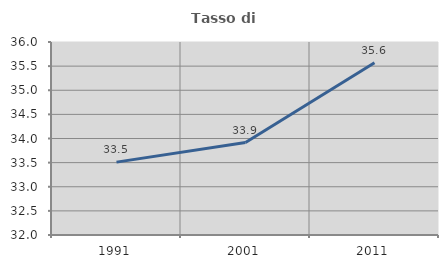
| Category | Tasso di occupazione   |
|---|---|
| 1991.0 | 33.511 |
| 2001.0 | 33.916 |
| 2011.0 | 35.568 |